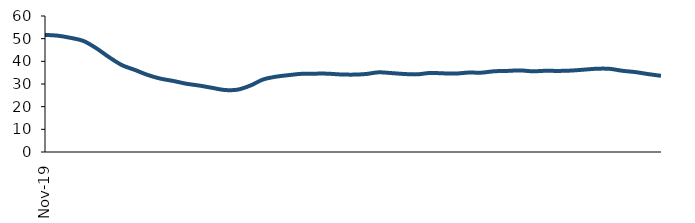
| Category | Series 0 |
|---|---|
| 2019-11-01 | 51.664 |
| 2019-12-01 | 51.311 |
| 2020-01-01 | 50.348 |
| 2020-02-01 | 48.978 |
| 2020-03-01 | 45.766 |
| 2020-04-01 | 41.808 |
| 2020-05-01 | 38.31 |
| 2020-06-01 | 36.214 |
| 2020-07-01 | 33.993 |
| 2020-08-01 | 32.365 |
| 2020-09-01 | 31.338 |
| 2020-10-01 | 30.13 |
| 2020-11-01 | 29.326 |
| 2020-12-01 | 28.333 |
| 2021-01-01 | 27.356 |
| 2021-02-01 | 27.502 |
| 2021-03-01 | 29.312 |
| 2021-04-01 | 32.007 |
| 2021-05-01 | 33.224 |
| 2021-06-01 | 33.927 |
| 2021-07-01 | 34.496 |
| 2021-08-01 | 34.565 |
| 2021-09-01 | 34.562 |
| 2021-10-01 | 34.221 |
| 2021-11-01 | 34.137 |
| 2021-12-01 | 34.397 |
| 2022-01-01 | 35.154 |
| 2022-02-01 | 34.808 |
| 2022-03-01 | 34.415 |
| 2022-04-01 | 34.261 |
| 2022-05-01 | 34.87 |
| 2022-06-01 | 34.705 |
| 2022-07-01 | 34.592 |
| 2022-08-01 | 35.045 |
| 2022-09-01 | 35.003 |
| 2022-10-01 | 35.616 |
| 2022-11-01 | 35.763 |
| 2022-12-01 | 36.005 |
| 2023-01-01 | 35.604 |
| 2023-02-01 | 35.827 |
| 2023-03-01 | 35.769 |
| 2023-04-01 | 35.924 |
| 2023-05-01 | 36.331 |
| 2023-06-01 | 36.74 |
| 2023-07-01 | 36.693 |
| 2023-08-01 | 35.824 |
| 2023-09-01 | 35.253 |
| 2023-10-01 | 34.375 |
| 2023-11-01 | 33.606 |